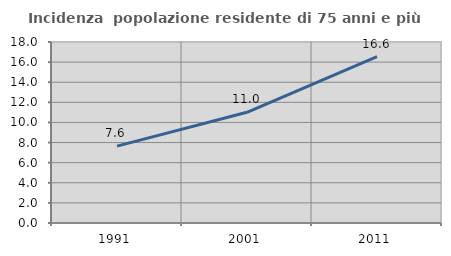
| Category | Incidenza  popolazione residente di 75 anni e più |
|---|---|
| 1991.0 | 7.649 |
| 2001.0 | 11.011 |
| 2011.0 | 16.554 |